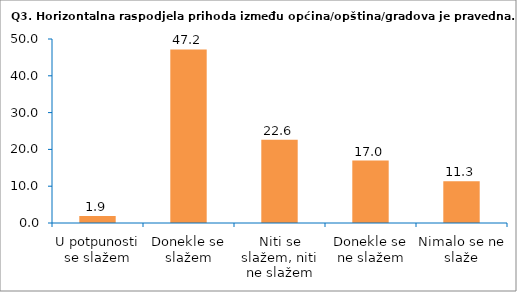
| Category | Series 0 |
|---|---|
| U potpunosti se slažem | 1.887 |
| Donekle se slažem | 47.17 |
| Niti se slažem, niti ne slažem | 22.642 |
| Donekle se ne slažem | 16.981 |
| Nimalo se ne slaže | 11.321 |